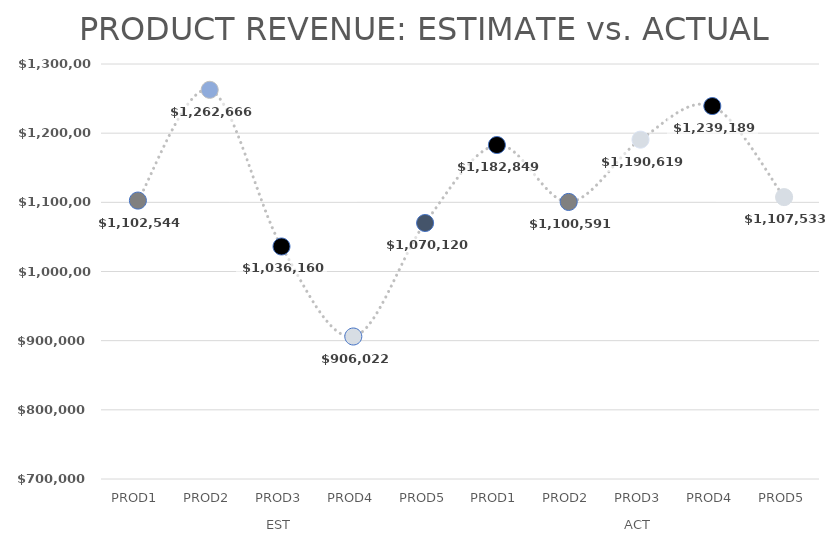
| Category | 2028 |
|---|---|
| 0 | 1102544 |
| 1 | 1262666 |
| 2 | 1036160 |
| 3 | 906022 |
| 4 | 1070120 |
| 5 | 1182849 |
| 6 | 1100591 |
| 7 | 1190619 |
| 8 | 1239189 |
| 9 | 1107533 |